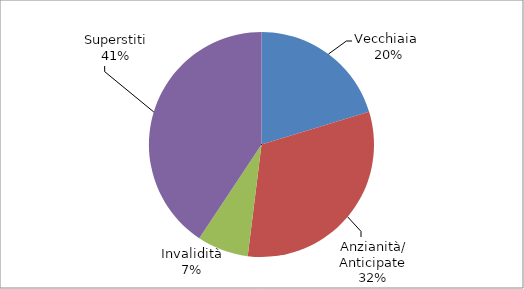
| Category | Series 0 |
|---|---|
| Vecchiaia  | 3031 |
| Anzianità/ Anticipate | 4734 |
| Invalidità | 1102 |
| Superstiti | 6078 |